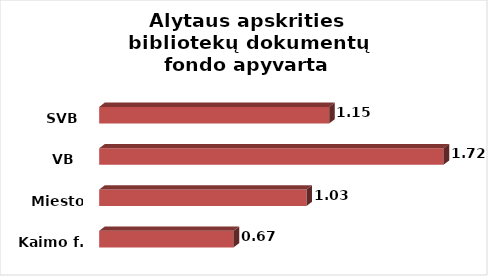
| Category | Series 0 |
|---|---|
| Kaimo f. | 0.671 |
| Miesto f. | 1.034 |
| VB  | 1.719 |
| SVB | 1.148 |